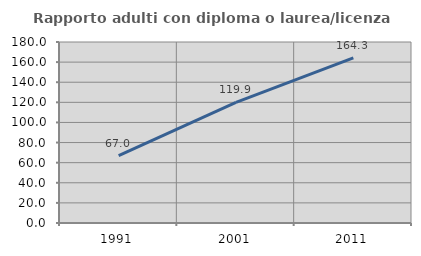
| Category | Rapporto adulti con diploma o laurea/licenza media  |
|---|---|
| 1991.0 | 66.988 |
| 2001.0 | 119.9 |
| 2011.0 | 164.286 |